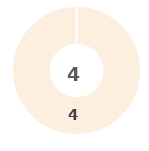
| Category | Series 0 |
|---|---|
| 0 | 0 |
| 1 | 0 |
| 2 | 0 |
| 3 | 0 |
| 4 | 4 |